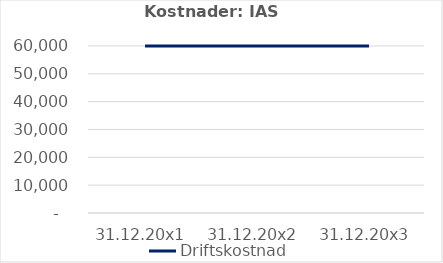
| Category | Driftskostnad |
|---|---|
| 31.12.20x1 | 60000 |
| 31.12.20x2 | 60000 |
| 31.12.20x3 | 60000 |